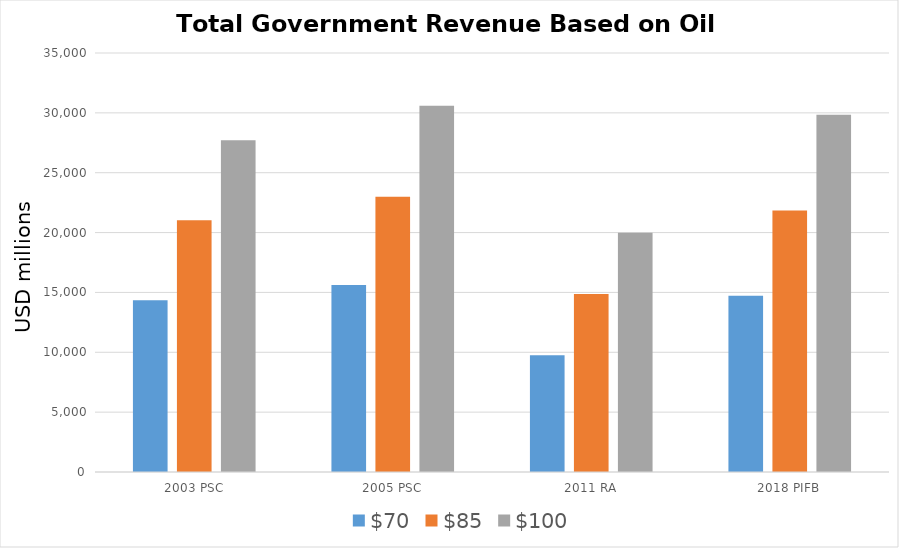
| Category | $70 | $85 | $100 |
|---|---|---|---|
| 2003 PSC | 14346.674 | 21024.201 | 27714.179 |
| 2005 PSC | 15614.786 | 22990.812 | 30588.091 |
| 2011 RA | 9754.428 | 14870.183 | 19985.938 |
| 2018 PIFB | 14714.311 | 21851.53 | 29838.146 |